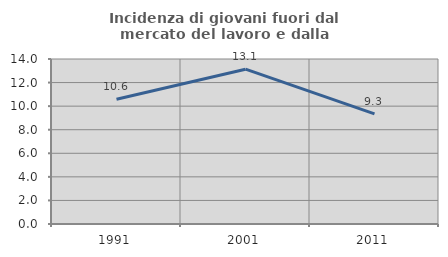
| Category | Incidenza di giovani fuori dal mercato del lavoro e dalla formazione  |
|---|---|
| 1991.0 | 10.588 |
| 2001.0 | 13.136 |
| 2011.0 | 9.346 |